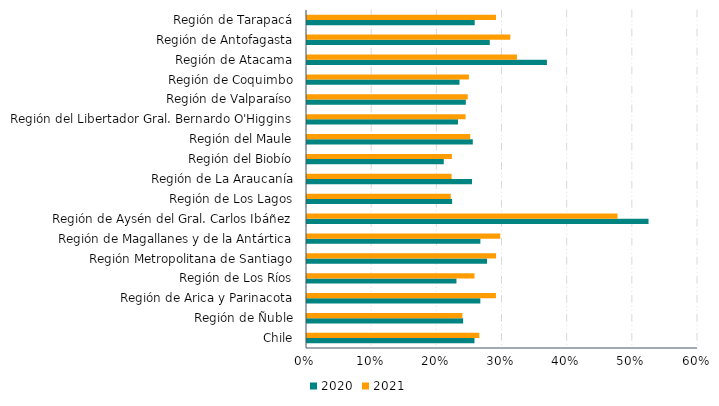
| Category | 2020 | 2021 |
|---|---|---|
| Chile | 0.257 | 0.264 |
| Región de Ñuble | 0.24 | 0.238 |
| Región de Arica y Parinacota | 0.266 | 0.29 |
| Región de Los Ríos | 0.229 | 0.257 |
| Región Metropolitana de Santiago | 0.276 | 0.29 |
| Región de Magallanes y de la Antártica | 0.266 | 0.296 |
| Región de Aysén del Gral. Carlos Ibáñez | 0.524 | 0.477 |
| Región de Los Lagos | 0.223 | 0.221 |
| Región de La Araucanía | 0.253 | 0.222 |
| Región del Biobío | 0.21 | 0.222 |
| Región del Maule | 0.254 | 0.251 |
| Región del Libertador Gral. Bernardo O'Higgins | 0.232 | 0.243 |
| Región de Valparaíso | 0.244 | 0.247 |
| Región de Coquimbo | 0.234 | 0.248 |
| Región de Atacama | 0.368 | 0.322 |
| Región de Antofagasta | 0.28 | 0.312 |
| Región de Tarapacá | 0.257 | 0.29 |